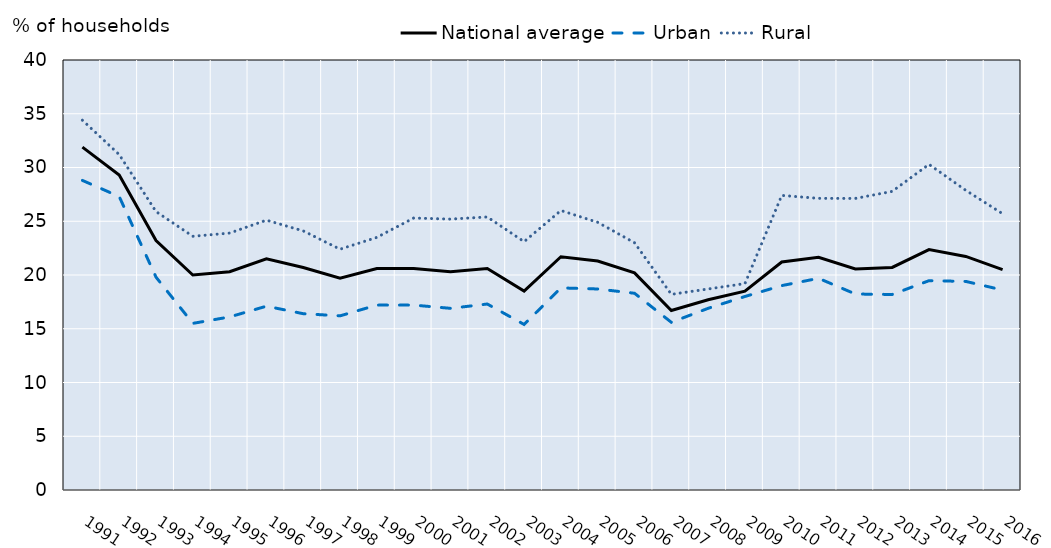
| Category | National average | Urban | Rural |
|---|---|---|---|
| 1991.0 | 31.9 | 28.8 | 34.4 |
| 1992.0 | 29.3 | 27.3 | 31.2 |
| 1993.0 | 23.2 | 19.8 | 25.9 |
| 1994.0 | 20 | 15.5 | 23.6 |
| 1995.0 | 20.3 | 16.1 | 23.9 |
| 1996.0 | 21.5 | 17.1 | 25.1 |
| 1997.0 | 20.7 | 16.4 | 24.1 |
| 1998.0 | 19.7 | 16.2 | 22.4 |
| 1999.0 | 20.6 | 17.2 | 23.5 |
| 2000.0 | 20.6 | 17.2 | 25.3 |
| 2001.0 | 20.3 | 16.9 | 25.2 |
| 2002.0 | 20.6 | 17.3 | 25.4 |
| 2003.0 | 18.5 | 15.4 | 23.1 |
| 2004.0 | 21.7 | 18.8 | 26 |
| 2005.0 | 21.3 | 18.7 | 24.9 |
| 2006.0 | 20.2 | 18.3 | 23 |
| 2007.0 | 16.7 | 15.6 | 18.2 |
| 2008.0 | 17.7 | 16.9 | 18.7 |
| 2009.0 | 18.5 | 18 | 19.2 |
| 2010.0 | 21.21 | 19.012 | 27.402 |
| 2011.0 | 21.652 | 19.692 | 27.13 |
| 2012.0 | 20.568 | 18.231 | 27.123 |
| 2013.0 | 20.701 | 18.188 | 27.777 |
| 2014.0 | 22.368 | 19.471 | 30.292 |
| 2015.0 | 21.726 | 19.404 | 27.876 |
| 2016.0 | 20.5 | 18.6 | 25.7 |